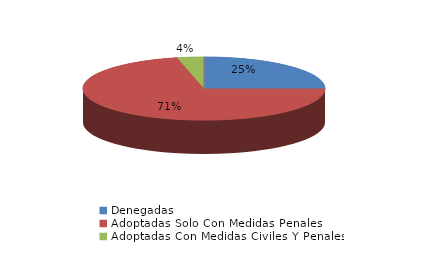
| Category | Series 0 |
|---|---|
| Denegadas | 7 |
| Adoptadas Solo Con Medidas Penales | 20 |
| Adoptadas Con Medidas Civiles Y Penales | 1 |
| Adoptadas Con Medidas Solo Civiles | 0 |